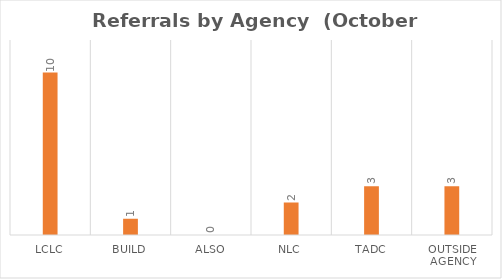
| Category | Series 0 |
|---|---|
| LCLC | 10 |
| BUILD | 1 |
| ALSO | 0 |
| NLC | 2 |
| TADC | 3 |
| Outside Agency | 3 |